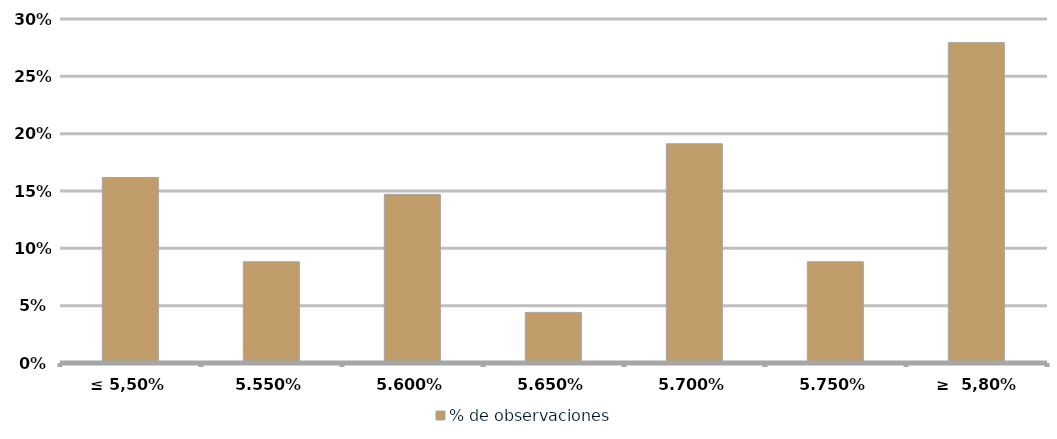
| Category | % de observaciones  |
|---|---|
| ≤ 5,50% | 0.162 |
| 5,55% | 0.088 |
| 5,60% | 0.147 |
| 5,65% | 0.044 |
| 5,70% | 0.191 |
| 5,75% | 0.088 |
| ≥  5,80% | 0.279 |